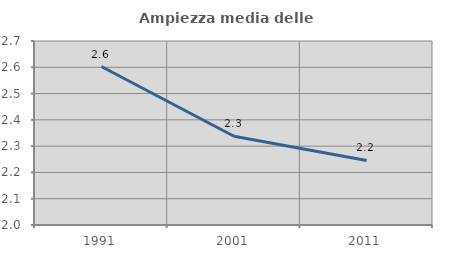
| Category | Ampiezza media delle famiglie |
|---|---|
| 1991.0 | 2.603 |
| 2001.0 | 2.338 |
| 2011.0 | 2.246 |